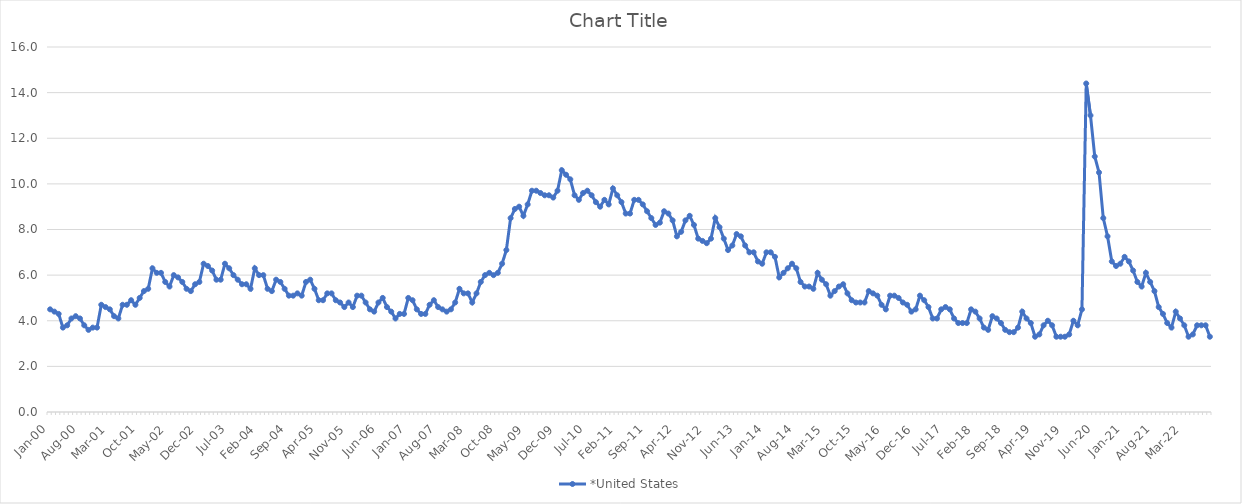
| Category | *United States | Alaska | Alabama | Arkansas | Arizona | California | Colorado | Connecticut | Delaware | Florida | Georgia | Hawaii | Iowa | Idaho | Illinois | Indiana | Kansas | Kentucky | Louisiana | Massachusetts | Maryland | Maine | Michigan | Minnesota | Missouri | Mississippi | Montana | North Carolina | North Dakota | Nebraska | New Hampshire | New Jersey | New Mexico | Nevada | New York | Ohio | Oklahoma | Oregon | Pennsylvania | Rhode Island | South Carolina | South Dakota | Tennessee | Texas | Utah | Virginia | Vermont | Washington | Wisconsin | West Virginia | Wyoming |
|---|---|---|---|---|---|---|---|---|---|---|---|---|---|---|---|---|---|---|---|---|---|---|---|---|---|---|---|---|---|---|---|---|---|---|---|---|---|---|---|---|---|---|---|---|---|---|---|---|---|---|---|
| Jan-00 | 4.5 |  |  |  |  |  |  |  |  |  |  |  |  |  |  |  |  |  |  |  |  |  |  |  |  |  |  |  |  |  |  |  |  |  |  |  |  |  |  |  |  |  |  |  |  |  |  |  |  |  |  |
| Feb-00 | 4.4 |  |  |  |  |  |  |  |  |  |  |  |  |  |  |  |  |  |  |  |  |  |  |  |  |  |  |  |  |  |  |  |  |  |  |  |  |  |  |  |  |  |  |  |  |  |  |  |  |  |  |
| Mar-00 | 4.3 |  |  |  |  |  |  |  |  |  |  |  |  |  |  |  |  |  |  |  |  |  |  |  |  |  |  |  |  |  |  |  |  |  |  |  |  |  |  |  |  |  |  |  |  |  |  |  |  |  |  |
| Apr-00 | 3.7 |  |  |  |  |  |  |  |  |  |  |  |  |  |  |  |  |  |  |  |  |  |  |  |  |  |  |  |  |  |  |  |  |  |  |  |  |  |  |  |  |  |  |  |  |  |  |  |  |  |  |
| May-00 | 3.8 |  |  |  |  |  |  |  |  |  |  |  |  |  |  |  |  |  |  |  |  |  |  |  |  |  |  |  |  |  |  |  |  |  |  |  |  |  |  |  |  |  |  |  |  |  |  |  |  |  |  |
| Jun-00 | 4.1 |  |  |  |  |  |  |  |  |  |  |  |  |  |  |  |  |  |  |  |  |  |  |  |  |  |  |  |  |  |  |  |  |  |  |  |  |  |  |  |  |  |  |  |  |  |  |  |  |  |  |
| Jul-00 | 4.2 |  |  |  |  |  |  |  |  |  |  |  |  |  |  |  |  |  |  |  |  |  |  |  |  |  |  |  |  |  |  |  |  |  |  |  |  |  |  |  |  |  |  |  |  |  |  |  |  |  |  |
| Aug-00 | 4.1 |  |  |  |  |  |  |  |  |  |  |  |  |  |  |  |  |  |  |  |  |  |  |  |  |  |  |  |  |  |  |  |  |  |  |  |  |  |  |  |  |  |  |  |  |  |  |  |  |  |  |
| Sep-00 | 3.8 |  |  |  |  |  |  |  |  |  |  |  |  |  |  |  |  |  |  |  |  |  |  |  |  |  |  |  |  |  |  |  |  |  |  |  |  |  |  |  |  |  |  |  |  |  |  |  |  |  |  |
| Oct-00 | 3.6 |  |  |  |  |  |  |  |  |  |  |  |  |  |  |  |  |  |  |  |  |  |  |  |  |  |  |  |  |  |  |  |  |  |  |  |  |  |  |  |  |  |  |  |  |  |  |  |  |  |  |
| Nov-00 | 3.7 |  |  |  |  |  |  |  |  |  |  |  |  |  |  |  |  |  |  |  |  |  |  |  |  |  |  |  |  |  |  |  |  |  |  |  |  |  |  |  |  |  |  |  |  |  |  |  |  |  |  |
| Dec-00 | 3.7 |  |  |  |  |  |  |  |  |  |  |  |  |  |  |  |  |  |  |  |  |  |  |  |  |  |  |  |  |  |  |  |  |  |  |  |  |  |  |  |  |  |  |  |  |  |  |  |  |  |  |
| Jan-01 | 4.7 |  |  |  |  |  |  |  |  |  |  |  |  |  |  |  |  |  |  |  |  |  |  |  |  |  |  |  |  |  |  |  |  |  |  |  |  |  |  |  |  |  |  |  |  |  |  |  |  |  |  |
| Feb-01 | 4.6 |  |  |  |  |  |  |  |  |  |  |  |  |  |  |  |  |  |  |  |  |  |  |  |  |  |  |  |  |  |  |  |  |  |  |  |  |  |  |  |  |  |  |  |  |  |  |  |  |  |  |
| Mar-01 | 4.5 |  |  |  |  |  |  |  |  |  |  |  |  |  |  |  |  |  |  |  |  |  |  |  |  |  |  |  |  |  |  |  |  |  |  |  |  |  |  |  |  |  |  |  |  |  |  |  |  |  |  |
| Apr-01 | 4.2 |  |  |  |  |  |  |  |  |  |  |  |  |  |  |  |  |  |  |  |  |  |  |  |  |  |  |  |  |  |  |  |  |  |  |  |  |  |  |  |  |  |  |  |  |  |  |  |  |  |  |
| May-01 | 4.1 |  |  |  |  |  |  |  |  |  |  |  |  |  |  |  |  |  |  |  |  |  |  |  |  |  |  |  |  |  |  |  |  |  |  |  |  |  |  |  |  |  |  |  |  |  |  |  |  |  |  |
| Jun-01 | 4.7 |  |  |  |  |  |  |  |  |  |  |  |  |  |  |  |  |  |  |  |  |  |  |  |  |  |  |  |  |  |  |  |  |  |  |  |  |  |  |  |  |  |  |  |  |  |  |  |  |  |  |
| Jul-01 | 4.7 |  |  |  |  |  |  |  |  |  |  |  |  |  |  |  |  |  |  |  |  |  |  |  |  |  |  |  |  |  |  |  |  |  |  |  |  |  |  |  |  |  |  |  |  |  |  |  |  |  |  |
| Aug-01 | 4.9 |  |  |  |  |  |  |  |  |  |  |  |  |  |  |  |  |  |  |  |  |  |  |  |  |  |  |  |  |  |  |  |  |  |  |  |  |  |  |  |  |  |  |  |  |  |  |  |  |  |  |
| Sep-01 | 4.7 |  |  |  |  |  |  |  |  |  |  |  |  |  |  |  |  |  |  |  |  |  |  |  |  |  |  |  |  |  |  |  |  |  |  |  |  |  |  |  |  |  |  |  |  |  |  |  |  |  |  |
| Oct-01 | 5 |  |  |  |  |  |  |  |  |  |  |  |  |  |  |  |  |  |  |  |  |  |  |  |  |  |  |  |  |  |  |  |  |  |  |  |  |  |  |  |  |  |  |  |  |  |  |  |  |  |  |
| Nov-01 | 5.3 |  |  |  |  |  |  |  |  |  |  |  |  |  |  |  |  |  |  |  |  |  |  |  |  |  |  |  |  |  |  |  |  |  |  |  |  |  |  |  |  |  |  |  |  |  |  |  |  |  |  |
| Dec-01 | 5.4 |  |  |  |  |  |  |  |  |  |  |  |  |  |  |  |  |  |  |  |  |  |  |  |  |  |  |  |  |  |  |  |  |  |  |  |  |  |  |  |  |  |  |  |  |  |  |  |  |  |  |
| Jan-02 | 6.3 |  |  |  |  |  |  |  |  |  |  |  |  |  |  |  |  |  |  |  |  |  |  |  |  |  |  |  |  |  |  |  |  |  |  |  |  |  |  |  |  |  |  |  |  |  |  |  |  |  |  |
| Feb-02 | 6.1 |  |  |  |  |  |  |  |  |  |  |  |  |  |  |  |  |  |  |  |  |  |  |  |  |  |  |  |  |  |  |  |  |  |  |  |  |  |  |  |  |  |  |  |  |  |  |  |  |  |  |
| Mar-02 | 6.1 |  |  |  |  |  |  |  |  |  |  |  |  |  |  |  |  |  |  |  |  |  |  |  |  |  |  |  |  |  |  |  |  |  |  |  |  |  |  |  |  |  |  |  |  |  |  |  |  |  |  |
| Apr-02 | 5.7 |  |  |  |  |  |  |  |  |  |  |  |  |  |  |  |  |  |  |  |  |  |  |  |  |  |  |  |  |  |  |  |  |  |  |  |  |  |  |  |  |  |  |  |  |  |  |  |  |  |  |
| May-02 | 5.5 |  |  |  |  |  |  |  |  |  |  |  |  |  |  |  |  |  |  |  |  |  |  |  |  |  |  |  |  |  |  |  |  |  |  |  |  |  |  |  |  |  |  |  |  |  |  |  |  |  |  |
| Jun-02 | 6 |  |  |  |  |  |  |  |  |  |  |  |  |  |  |  |  |  |  |  |  |  |  |  |  |  |  |  |  |  |  |  |  |  |  |  |  |  |  |  |  |  |  |  |  |  |  |  |  |  |  |
| Jul-02 | 5.9 |  |  |  |  |  |  |  |  |  |  |  |  |  |  |  |  |  |  |  |  |  |  |  |  |  |  |  |  |  |  |  |  |  |  |  |  |  |  |  |  |  |  |  |  |  |  |  |  |  |  |
| Aug-02 | 5.7 |  |  |  |  |  |  |  |  |  |  |  |  |  |  |  |  |  |  |  |  |  |  |  |  |  |  |  |  |  |  |  |  |  |  |  |  |  |  |  |  |  |  |  |  |  |  |  |  |  |  |
| Sep-02 | 5.4 |  |  |  |  |  |  |  |  |  |  |  |  |  |  |  |  |  |  |  |  |  |  |  |  |  |  |  |  |  |  |  |  |  |  |  |  |  |  |  |  |  |  |  |  |  |  |  |  |  |  |
| Oct-02 | 5.3 |  |  |  |  |  |  |  |  |  |  |  |  |  |  |  |  |  |  |  |  |  |  |  |  |  |  |  |  |  |  |  |  |  |  |  |  |  |  |  |  |  |  |  |  |  |  |  |  |  |  |
| Nov-02 | 5.6 |  |  |  |  |  |  |  |  |  |  |  |  |  |  |  |  |  |  |  |  |  |  |  |  |  |  |  |  |  |  |  |  |  |  |  |  |  |  |  |  |  |  |  |  |  |  |  |  |  |  |
| Dec-02 | 5.7 |  |  |  |  |  |  |  |  |  |  |  |  |  |  |  |  |  |  |  |  |  |  |  |  |  |  |  |  |  |  |  |  |  |  |  |  |  |  |  |  |  |  |  |  |  |  |  |  |  |  |
| Jan-03 | 6.5 |  |  |  |  |  |  |  |  |  |  |  |  |  |  |  |  |  |  |  |  |  |  |  |  |  |  |  |  |  |  |  |  |  |  |  |  |  |  |  |  |  |  |  |  |  |  |  |  |  |  |
| Feb-03 | 6.4 |  |  |  |  |  |  |  |  |  |  |  |  |  |  |  |  |  |  |  |  |  |  |  |  |  |  |  |  |  |  |  |  |  |  |  |  |  |  |  |  |  |  |  |  |  |  |  |  |  |  |
| Mar-03 | 6.2 |  |  |  |  |  |  |  |  |  |  |  |  |  |  |  |  |  |  |  |  |  |  |  |  |  |  |  |  |  |  |  |  |  |  |  |  |  |  |  |  |  |  |  |  |  |  |  |  |  |  |
| Apr-03 | 5.8 |  |  |  |  |  |  |  |  |  |  |  |  |  |  |  |  |  |  |  |  |  |  |  |  |  |  |  |  |  |  |  |  |  |  |  |  |  |  |  |  |  |  |  |  |  |  |  |  |  |  |
| May-03 | 5.8 |  |  |  |  |  |  |  |  |  |  |  |  |  |  |  |  |  |  |  |  |  |  |  |  |  |  |  |  |  |  |  |  |  |  |  |  |  |  |  |  |  |  |  |  |  |  |  |  |  |  |
| Jun-03 | 6.5 |  |  |  |  |  |  |  |  |  |  |  |  |  |  |  |  |  |  |  |  |  |  |  |  |  |  |  |  |  |  |  |  |  |  |  |  |  |  |  |  |  |  |  |  |  |  |  |  |  |  |
| Jul-03 | 6.3 |  |  |  |  |  |  |  |  |  |  |  |  |  |  |  |  |  |  |  |  |  |  |  |  |  |  |  |  |  |  |  |  |  |  |  |  |  |  |  |  |  |  |  |  |  |  |  |  |  |  |
| Aug-03 | 6 |  |  |  |  |  |  |  |  |  |  |  |  |  |  |  |  |  |  |  |  |  |  |  |  |  |  |  |  |  |  |  |  |  |  |  |  |  |  |  |  |  |  |  |  |  |  |  |  |  |  |
| Sep-03 | 5.8 |  |  |  |  |  |  |  |  |  |  |  |  |  |  |  |  |  |  |  |  |  |  |  |  |  |  |  |  |  |  |  |  |  |  |  |  |  |  |  |  |  |  |  |  |  |  |  |  |  |  |
| Oct-03 | 5.6 |  |  |  |  |  |  |  |  |  |  |  |  |  |  |  |  |  |  |  |  |  |  |  |  |  |  |  |  |  |  |  |  |  |  |  |  |  |  |  |  |  |  |  |  |  |  |  |  |  |  |
| Nov-03 | 5.6 |  |  |  |  |  |  |  |  |  |  |  |  |  |  |  |  |  |  |  |  |  |  |  |  |  |  |  |  |  |  |  |  |  |  |  |  |  |  |  |  |  |  |  |  |  |  |  |  |  |  |
| Dec-03 | 5.4 |  |  |  |  |  |  |  |  |  |  |  |  |  |  |  |  |  |  |  |  |  |  |  |  |  |  |  |  |  |  |  |  |  |  |  |  |  |  |  |  |  |  |  |  |  |  |  |  |  |  |
| Jan-04 | 6.3 |  |  |  |  |  |  |  |  |  |  |  |  |  |  |  |  |  |  |  |  |  |  |  |  |  |  |  |  |  |  |  |  |  |  |  |  |  |  |  |  |  |  |  |  |  |  |  |  |  |  |
| Feb-04 | 6 |  |  |  |  |  |  |  |  |  |  |  |  |  |  |  |  |  |  |  |  |  |  |  |  |  |  |  |  |  |  |  |  |  |  |  |  |  |  |  |  |  |  |  |  |  |  |  |  |  |  |
| Mar-04 | 6 |  |  |  |  |  |  |  |  |  |  |  |  |  |  |  |  |  |  |  |  |  |  |  |  |  |  |  |  |  |  |  |  |  |  |  |  |  |  |  |  |  |  |  |  |  |  |  |  |  |  |
| Apr-04 | 5.4 |  |  |  |  |  |  |  |  |  |  |  |  |  |  |  |  |  |  |  |  |  |  |  |  |  |  |  |  |  |  |  |  |  |  |  |  |  |  |  |  |  |  |  |  |  |  |  |  |  |  |
| May-04 | 5.3 |  |  |  |  |  |  |  |  |  |  |  |  |  |  |  |  |  |  |  |  |  |  |  |  |  |  |  |  |  |  |  |  |  |  |  |  |  |  |  |  |  |  |  |  |  |  |  |  |  |  |
| Jun-04 | 5.8 |  |  |  |  |  |  |  |  |  |  |  |  |  |  |  |  |  |  |  |  |  |  |  |  |  |  |  |  |  |  |  |  |  |  |  |  |  |  |  |  |  |  |  |  |  |  |  |  |  |  |
| Jul-04 | 5.7 |  |  |  |  |  |  |  |  |  |  |  |  |  |  |  |  |  |  |  |  |  |  |  |  |  |  |  |  |  |  |  |  |  |  |  |  |  |  |  |  |  |  |  |  |  |  |  |  |  |  |
| Aug-04 | 5.4 |  |  |  |  |  |  |  |  |  |  |  |  |  |  |  |  |  |  |  |  |  |  |  |  |  |  |  |  |  |  |  |  |  |  |  |  |  |  |  |  |  |  |  |  |  |  |  |  |  |  |
| Sep-04 | 5.1 |  |  |  |  |  |  |  |  |  |  |  |  |  |  |  |  |  |  |  |  |  |  |  |  |  |  |  |  |  |  |  |  |  |  |  |  |  |  |  |  |  |  |  |  |  |  |  |  |  |  |
| Oct-04 | 5.1 |  |  |  |  |  |  |  |  |  |  |  |  |  |  |  |  |  |  |  |  |  |  |  |  |  |  |  |  |  |  |  |  |  |  |  |  |  |  |  |  |  |  |  |  |  |  |  |  |  |  |
| Nov-04 | 5.2 |  |  |  |  |  |  |  |  |  |  |  |  |  |  |  |  |  |  |  |  |  |  |  |  |  |  |  |  |  |  |  |  |  |  |  |  |  |  |  |  |  |  |  |  |  |  |  |  |  |  |
| Dec-04 | 5.1 |  |  |  |  |  |  |  |  |  |  |  |  |  |  |  |  |  |  |  |  |  |  |  |  |  |  |  |  |  |  |  |  |  |  |  |  |  |  |  |  |  |  |  |  |  |  |  |  |  |  |
| Jan-05 | 5.7 |  |  |  |  |  |  |  |  |  |  |  |  |  |  |  |  |  |  |  |  |  |  |  |  |  |  |  |  |  |  |  |  |  |  |  |  |  |  |  |  |  |  |  |  |  |  |  |  |  |  |
| Feb-05 | 5.8 |  |  |  |  |  |  |  |  |  |  |  |  |  |  |  |  |  |  |  |  |  |  |  |  |  |  |  |  |  |  |  |  |  |  |  |  |  |  |  |  |  |  |  |  |  |  |  |  |  |  |
| Mar-05 | 5.4 |  |  |  |  |  |  |  |  |  |  |  |  |  |  |  |  |  |  |  |  |  |  |  |  |  |  |  |  |  |  |  |  |  |  |  |  |  |  |  |  |  |  |  |  |  |  |  |  |  |  |
| Apr-05 | 4.9 |  |  |  |  |  |  |  |  |  |  |  |  |  |  |  |  |  |  |  |  |  |  |  |  |  |  |  |  |  |  |  |  |  |  |  |  |  |  |  |  |  |  |  |  |  |  |  |  |  |  |
| May-05 | 4.9 |  |  |  |  |  |  |  |  |  |  |  |  |  |  |  |  |  |  |  |  |  |  |  |  |  |  |  |  |  |  |  |  |  |  |  |  |  |  |  |  |  |  |  |  |  |  |  |  |  |  |
| Jun-05 | 5.2 |  |  |  |  |  |  |  |  |  |  |  |  |  |  |  |  |  |  |  |  |  |  |  |  |  |  |  |  |  |  |  |  |  |  |  |  |  |  |  |  |  |  |  |  |  |  |  |  |  |  |
| Jul-05 | 5.2 |  |  |  |  |  |  |  |  |  |  |  |  |  |  |  |  |  |  |  |  |  |  |  |  |  |  |  |  |  |  |  |  |  |  |  |  |  |  |  |  |  |  |  |  |  |  |  |  |  |  |
| Aug-05 | 4.9 |  |  |  |  |  |  |  |  |  |  |  |  |  |  |  |  |  |  |  |  |  |  |  |  |  |  |  |  |  |  |  |  |  |  |  |  |  |  |  |  |  |  |  |  |  |  |  |  |  |  |
| Sep-05 | 4.8 |  |  |  |  |  |  |  |  |  |  |  |  |  |  |  |  |  |  |  |  |  |  |  |  |  |  |  |  |  |  |  |  |  |  |  |  |  |  |  |  |  |  |  |  |  |  |  |  |  |  |
| Oct-05 | 4.6 |  |  |  |  |  |  |  |  |  |  |  |  |  |  |  |  |  |  |  |  |  |  |  |  |  |  |  |  |  |  |  |  |  |  |  |  |  |  |  |  |  |  |  |  |  |  |  |  |  |  |
| Nov-05 | 4.8 |  |  |  |  |  |  |  |  |  |  |  |  |  |  |  |  |  |  |  |  |  |  |  |  |  |  |  |  |  |  |  |  |  |  |  |  |  |  |  |  |  |  |  |  |  |  |  |  |  |  |
| Dec-05 | 4.6 |  |  |  |  |  |  |  |  |  |  |  |  |  |  |  |  |  |  |  |  |  |  |  |  |  |  |  |  |  |  |  |  |  |  |  |  |  |  |  |  |  |  |  |  |  |  |  |  |  |  |
| Jan-06 | 5.1 |  |  |  |  |  |  |  |  |  |  |  |  |  |  |  |  |  |  |  |  |  |  |  |  |  |  |  |  |  |  |  |  |  |  |  |  |  |  |  |  |  |  |  |  |  |  |  |  |  |  |
| Feb-06 | 5.1 |  |  |  |  |  |  |  |  |  |  |  |  |  |  |  |  |  |  |  |  |  |  |  |  |  |  |  |  |  |  |  |  |  |  |  |  |  |  |  |  |  |  |  |  |  |  |  |  |  |  |
| Mar-06 | 4.8 |  |  |  |  |  |  |  |  |  |  |  |  |  |  |  |  |  |  |  |  |  |  |  |  |  |  |  |  |  |  |  |  |  |  |  |  |  |  |  |  |  |  |  |  |  |  |  |  |  |  |
| Apr-06 | 4.5 |  |  |  |  |  |  |  |  |  |  |  |  |  |  |  |  |  |  |  |  |  |  |  |  |  |  |  |  |  |  |  |  |  |  |  |  |  |  |  |  |  |  |  |  |  |  |  |  |  |  |
| May-06 | 4.4 |  |  |  |  |  |  |  |  |  |  |  |  |  |  |  |  |  |  |  |  |  |  |  |  |  |  |  |  |  |  |  |  |  |  |  |  |  |  |  |  |  |  |  |  |  |  |  |  |  |  |
| Jun-06 | 4.8 |  |  |  |  |  |  |  |  |  |  |  |  |  |  |  |  |  |  |  |  |  |  |  |  |  |  |  |  |  |  |  |  |  |  |  |  |  |  |  |  |  |  |  |  |  |  |  |  |  |  |
| Jul-06 | 5 |  |  |  |  |  |  |  |  |  |  |  |  |  |  |  |  |  |  |  |  |  |  |  |  |  |  |  |  |  |  |  |  |  |  |  |  |  |  |  |  |  |  |  |  |  |  |  |  |  |  |
| Aug-06 | 4.6 |  |  |  |  |  |  |  |  |  |  |  |  |  |  |  |  |  |  |  |  |  |  |  |  |  |  |  |  |  |  |  |  |  |  |  |  |  |  |  |  |  |  |  |  |  |  |  |  |  |  |
| Sep-06 | 4.4 |  |  |  |  |  |  |  |  |  |  |  |  |  |  |  |  |  |  |  |  |  |  |  |  |  |  |  |  |  |  |  |  |  |  |  |  |  |  |  |  |  |  |  |  |  |  |  |  |  |  |
| Oct-06 | 4.1 |  |  |  |  |  |  |  |  |  |  |  |  |  |  |  |  |  |  |  |  |  |  |  |  |  |  |  |  |  |  |  |  |  |  |  |  |  |  |  |  |  |  |  |  |  |  |  |  |  |  |
| Nov-06 | 4.3 |  |  |  |  |  |  |  |  |  |  |  |  |  |  |  |  |  |  |  |  |  |  |  |  |  |  |  |  |  |  |  |  |  |  |  |  |  |  |  |  |  |  |  |  |  |  |  |  |  |  |
| Dec-06 | 4.3 |  |  |  |  |  |  |  |  |  |  |  |  |  |  |  |  |  |  |  |  |  |  |  |  |  |  |  |  |  |  |  |  |  |  |  |  |  |  |  |  |  |  |  |  |  |  |  |  |  |  |
| Jan-07 | 5 |  |  |  |  |  |  |  |  |  |  |  |  |  |  |  |  |  |  |  |  |  |  |  |  |  |  |  |  |  |  |  |  |  |  |  |  |  |  |  |  |  |  |  |  |  |  |  |  |  |  |
| Feb-07 | 4.9 |  |  |  |  |  |  |  |  |  |  |  |  |  |  |  |  |  |  |  |  |  |  |  |  |  |  |  |  |  |  |  |  |  |  |  |  |  |  |  |  |  |  |  |  |  |  |  |  |  |  |
| Mar-07 | 4.5 |  |  |  |  |  |  |  |  |  |  |  |  |  |  |  |  |  |  |  |  |  |  |  |  |  |  |  |  |  |  |  |  |  |  |  |  |  |  |  |  |  |  |  |  |  |  |  |  |  |  |
| Apr-07 | 4.3 |  |  |  |  |  |  |  |  |  |  |  |  |  |  |  |  |  |  |  |  |  |  |  |  |  |  |  |  |  |  |  |  |  |  |  |  |  |  |  |  |  |  |  |  |  |  |  |  |  |  |
| May-07 | 4.3 |  |  |  |  |  |  |  |  |  |  |  |  |  |  |  |  |  |  |  |  |  |  |  |  |  |  |  |  |  |  |  |  |  |  |  |  |  |  |  |  |  |  |  |  |  |  |  |  |  |  |
| Jun-07 | 4.7 |  |  |  |  |  |  |  |  |  |  |  |  |  |  |  |  |  |  |  |  |  |  |  |  |  |  |  |  |  |  |  |  |  |  |  |  |  |  |  |  |  |  |  |  |  |  |  |  |  |  |
| Jul-07 | 4.9 |  |  |  |  |  |  |  |  |  |  |  |  |  |  |  |  |  |  |  |  |  |  |  |  |  |  |  |  |  |  |  |  |  |  |  |  |  |  |  |  |  |  |  |  |  |  |  |  |  |  |
| Aug-07 | 4.6 |  |  |  |  |  |  |  |  |  |  |  |  |  |  |  |  |  |  |  |  |  |  |  |  |  |  |  |  |  |  |  |  |  |  |  |  |  |  |  |  |  |  |  |  |  |  |  |  |  |  |
| Sep-07 | 4.5 |  |  |  |  |  |  |  |  |  |  |  |  |  |  |  |  |  |  |  |  |  |  |  |  |  |  |  |  |  |  |  |  |  |  |  |  |  |  |  |  |  |  |  |  |  |  |  |  |  |  |
| Oct-07 | 4.4 |  |  |  |  |  |  |  |  |  |  |  |  |  |  |  |  |  |  |  |  |  |  |  |  |  |  |  |  |  |  |  |  |  |  |  |  |  |  |  |  |  |  |  |  |  |  |  |  |  |  |
| Nov-07 | 4.5 |  |  |  |  |  |  |  |  |  |  |  |  |  |  |  |  |  |  |  |  |  |  |  |  |  |  |  |  |  |  |  |  |  |  |  |  |  |  |  |  |  |  |  |  |  |  |  |  |  |  |
| Dec-07 | 4.8 |  |  |  |  |  |  |  |  |  |  |  |  |  |  |  |  |  |  |  |  |  |  |  |  |  |  |  |  |  |  |  |  |  |  |  |  |  |  |  |  |  |  |  |  |  |  |  |  |  |  |
| Jan-08 | 5.4 |  |  |  |  |  |  |  |  |  |  |  |  |  |  |  |  |  |  |  |  |  |  |  |  |  |  |  |  |  |  |  |  |  |  |  |  |  |  |  |  |  |  |  |  |  |  |  |  |  |  |
| Feb-08 | 5.2 |  |  |  |  |  |  |  |  |  |  |  |  |  |  |  |  |  |  |  |  |  |  |  |  |  |  |  |  |  |  |  |  |  |  |  |  |  |  |  |  |  |  |  |  |  |  |  |  |  |  |
| Mar-08 | 5.2 |  |  |  |  |  |  |  |  |  |  |  |  |  |  |  |  |  |  |  |  |  |  |  |  |  |  |  |  |  |  |  |  |  |  |  |  |  |  |  |  |  |  |  |  |  |  |  |  |  |  |
| Apr-08 | 4.8 |  |  |  |  |  |  |  |  |  |  |  |  |  |  |  |  |  |  |  |  |  |  |  |  |  |  |  |  |  |  |  |  |  |  |  |  |  |  |  |  |  |  |  |  |  |  |  |  |  |  |
| May-08 | 5.2 |  |  |  |  |  |  |  |  |  |  |  |  |  |  |  |  |  |  |  |  |  |  |  |  |  |  |  |  |  |  |  |  |  |  |  |  |  |  |  |  |  |  |  |  |  |  |  |  |  |  |
| Jun-08 | 5.7 |  |  |  |  |  |  |  |  |  |  |  |  |  |  |  |  |  |  |  |  |  |  |  |  |  |  |  |  |  |  |  |  |  |  |  |  |  |  |  |  |  |  |  |  |  |  |  |  |  |  |
| Jul-08 | 6 |  |  |  |  |  |  |  |  |  |  |  |  |  |  |  |  |  |  |  |  |  |  |  |  |  |  |  |  |  |  |  |  |  |  |  |  |  |  |  |  |  |  |  |  |  |  |  |  |  |  |
| Aug-08 | 6.1 |  |  |  |  |  |  |  |  |  |  |  |  |  |  |  |  |  |  |  |  |  |  |  |  |  |  |  |  |  |  |  |  |  |  |  |  |  |  |  |  |  |  |  |  |  |  |  |  |  |  |
| Sep-08 | 6 |  |  |  |  |  |  |  |  |  |  |  |  |  |  |  |  |  |  |  |  |  |  |  |  |  |  |  |  |  |  |  |  |  |  |  |  |  |  |  |  |  |  |  |  |  |  |  |  |  |  |
| Oct-08 | 6.1 |  |  |  |  |  |  |  |  |  |  |  |  |  |  |  |  |  |  |  |  |  |  |  |  |  |  |  |  |  |  |  |  |  |  |  |  |  |  |  |  |  |  |  |  |  |  |  |  |  |  |
| Nov-08 | 6.5 |  |  |  |  |  |  |  |  |  |  |  |  |  |  |  |  |  |  |  |  |  |  |  |  |  |  |  |  |  |  |  |  |  |  |  |  |  |  |  |  |  |  |  |  |  |  |  |  |  |  |
| Dec-08 | 7.1 |  |  |  |  |  |  |  |  |  |  |  |  |  |  |  |  |  |  |  |  |  |  |  |  |  |  |  |  |  |  |  |  |  |  |  |  |  |  |  |  |  |  |  |  |  |  |  |  |  |  |
| Jan-09 | 8.5 |  |  |  |  |  |  |  |  |  |  |  |  |  |  |  |  |  |  |  |  |  |  |  |  |  |  |  |  |  |  |  |  |  |  |  |  |  |  |  |  |  |  |  |  |  |  |  |  |  |  |
| Feb-09 | 8.9 |  |  |  |  |  |  |  |  |  |  |  |  |  |  |  |  |  |  |  |  |  |  |  |  |  |  |  |  |  |  |  |  |  |  |  |  |  |  |  |  |  |  |  |  |  |  |  |  |  |  |
| Mar-09 | 9 |  |  |  |  |  |  |  |  |  |  |  |  |  |  |  |  |  |  |  |  |  |  |  |  |  |  |  |  |  |  |  |  |  |  |  |  |  |  |  |  |  |  |  |  |  |  |  |  |  |  |
| Apr-09 | 8.6 |  |  |  |  |  |  |  |  |  |  |  |  |  |  |  |  |  |  |  |  |  |  |  |  |  |  |  |  |  |  |  |  |  |  |  |  |  |  |  |  |  |  |  |  |  |  |  |  |  |  |
| May-09 | 9.1 |  |  |  |  |  |  |  |  |  |  |  |  |  |  |  |  |  |  |  |  |  |  |  |  |  |  |  |  |  |  |  |  |  |  |  |  |  |  |  |  |  |  |  |  |  |  |  |  |  |  |
| Jun-09 | 9.7 |  |  |  |  |  |  |  |  |  |  |  |  |  |  |  |  |  |  |  |  |  |  |  |  |  |  |  |  |  |  |  |  |  |  |  |  |  |  |  |  |  |  |  |  |  |  |  |  |  |  |
| Jul-09 | 9.7 |  |  |  |  |  |  |  |  |  |  |  |  |  |  |  |  |  |  |  |  |  |  |  |  |  |  |  |  |  |  |  |  |  |  |  |  |  |  |  |  |  |  |  |  |  |  |  |  |  |  |
| Aug-09 | 9.6 |  |  |  |  |  |  |  |  |  |  |  |  |  |  |  |  |  |  |  |  |  |  |  |  |  |  |  |  |  |  |  |  |  |  |  |  |  |  |  |  |  |  |  |  |  |  |  |  |  |  |
| Sep-09 | 9.5 |  |  |  |  |  |  |  |  |  |  |  |  |  |  |  |  |  |  |  |  |  |  |  |  |  |  |  |  |  |  |  |  |  |  |  |  |  |  |  |  |  |  |  |  |  |  |  |  |  |  |
| Oct-09 | 9.5 |  |  |  |  |  |  |  |  |  |  |  |  |  |  |  |  |  |  |  |  |  |  |  |  |  |  |  |  |  |  |  |  |  |  |  |  |  |  |  |  |  |  |  |  |  |  |  |  |  |  |
| Nov-09 | 9.4 |  |  |  |  |  |  |  |  |  |  |  |  |  |  |  |  |  |  |  |  |  |  |  |  |  |  |  |  |  |  |  |  |  |  |  |  |  |  |  |  |  |  |  |  |  |  |  |  |  |  |
| Dec-09 | 9.7 |  |  |  |  |  |  |  |  |  |  |  |  |  |  |  |  |  |  |  |  |  |  |  |  |  |  |  |  |  |  |  |  |  |  |  |  |  |  |  |  |  |  |  |  |  |  |  |  |  |  |
| Jan-10 | 10.6 |  |  |  |  |  |  |  |  |  |  |  |  |  |  |  |  |  |  |  |  |  |  |  |  |  |  |  |  |  |  |  |  |  |  |  |  |  |  |  |  |  |  |  |  |  |  |  |  |  |  |
| Feb-10 | 10.4 |  |  |  |  |  |  |  |  |  |  |  |  |  |  |  |  |  |  |  |  |  |  |  |  |  |  |  |  |  |  |  |  |  |  |  |  |  |  |  |  |  |  |  |  |  |  |  |  |  |  |
| Mar-10 | 10.2 |  |  |  |  |  |  |  |  |  |  |  |  |  |  |  |  |  |  |  |  |  |  |  |  |  |  |  |  |  |  |  |  |  |  |  |  |  |  |  |  |  |  |  |  |  |  |  |  |  |  |
| Apr-10 | 9.5 |  |  |  |  |  |  |  |  |  |  |  |  |  |  |  |  |  |  |  |  |  |  |  |  |  |  |  |  |  |  |  |  |  |  |  |  |  |  |  |  |  |  |  |  |  |  |  |  |  |  |
| May-10 | 9.3 |  |  |  |  |  |  |  |  |  |  |  |  |  |  |  |  |  |  |  |  |  |  |  |  |  |  |  |  |  |  |  |  |  |  |  |  |  |  |  |  |  |  |  |  |  |  |  |  |  |  |
| Jun-10 | 9.6 |  |  |  |  |  |  |  |  |  |  |  |  |  |  |  |  |  |  |  |  |  |  |  |  |  |  |  |  |  |  |  |  |  |  |  |  |  |  |  |  |  |  |  |  |  |  |  |  |  |  |
| Jul-10 | 9.7 |  |  |  |  |  |  |  |  |  |  |  |  |  |  |  |  |  |  |  |  |  |  |  |  |  |  |  |  |  |  |  |  |  |  |  |  |  |  |  |  |  |  |  |  |  |  |  |  |  |  |
| Aug-10 | 9.5 |  |  |  |  |  |  |  |  |  |  |  |  |  |  |  |  |  |  |  |  |  |  |  |  |  |  |  |  |  |  |  |  |  |  |  |  |  |  |  |  |  |  |  |  |  |  |  |  |  |  |
| Sep-10 | 9.2 |  |  |  |  |  |  |  |  |  |  |  |  |  |  |  |  |  |  |  |  |  |  |  |  |  |  |  |  |  |  |  |  |  |  |  |  |  |  |  |  |  |  |  |  |  |  |  |  |  |  |
| Oct-10 | 9 |  |  |  |  |  |  |  |  |  |  |  |  |  |  |  |  |  |  |  |  |  |  |  |  |  |  |  |  |  |  |  |  |  |  |  |  |  |  |  |  |  |  |  |  |  |  |  |  |  |  |
| Nov-10 | 9.3 |  |  |  |  |  |  |  |  |  |  |  |  |  |  |  |  |  |  |  |  |  |  |  |  |  |  |  |  |  |  |  |  |  |  |  |  |  |  |  |  |  |  |  |  |  |  |  |  |  |  |
| Dec-10 | 9.1 |  |  |  |  |  |  |  |  |  |  |  |  |  |  |  |  |  |  |  |  |  |  |  |  |  |  |  |  |  |  |  |  |  |  |  |  |  |  |  |  |  |  |  |  |  |  |  |  |  |  |
| Jan-11 | 9.8 |  |  |  |  |  |  |  |  |  |  |  |  |  |  |  |  |  |  |  |  |  |  |  |  |  |  |  |  |  |  |  |  |  |  |  |  |  |  |  |  |  |  |  |  |  |  |  |  |  |  |
| Feb-11 | 9.5 |  |  |  |  |  |  |  |  |  |  |  |  |  |  |  |  |  |  |  |  |  |  |  |  |  |  |  |  |  |  |  |  |  |  |  |  |  |  |  |  |  |  |  |  |  |  |  |  |  |  |
| Mar-11 | 9.2 |  |  |  |  |  |  |  |  |  |  |  |  |  |  |  |  |  |  |  |  |  |  |  |  |  |  |  |  |  |  |  |  |  |  |  |  |  |  |  |  |  |  |  |  |  |  |  |  |  |  |
| Apr-11 | 8.7 |  |  |  |  |  |  |  |  |  |  |  |  |  |  |  |  |  |  |  |  |  |  |  |  |  |  |  |  |  |  |  |  |  |  |  |  |  |  |  |  |  |  |  |  |  |  |  |  |  |  |
| May-11 | 8.7 |  |  |  |  |  |  |  |  |  |  |  |  |  |  |  |  |  |  |  |  |  |  |  |  |  |  |  |  |  |  |  |  |  |  |  |  |  |  |  |  |  |  |  |  |  |  |  |  |  |  |
| Jun-11 | 9.3 |  |  |  |  |  |  |  |  |  |  |  |  |  |  |  |  |  |  |  |  |  |  |  |  |  |  |  |  |  |  |  |  |  |  |  |  |  |  |  |  |  |  |  |  |  |  |  |  |  |  |
| Jul-11 | 9.3 |  |  |  |  |  |  |  |  |  |  |  |  |  |  |  |  |  |  |  |  |  |  |  |  |  |  |  |  |  |  |  |  |  |  |  |  |  |  |  |  |  |  |  |  |  |  |  |  |  |  |
| Aug-11 | 9.1 |  |  |  |  |  |  |  |  |  |  |  |  |  |  |  |  |  |  |  |  |  |  |  |  |  |  |  |  |  |  |  |  |  |  |  |  |  |  |  |  |  |  |  |  |  |  |  |  |  |  |
| Sep-11 | 8.8 |  |  |  |  |  |  |  |  |  |  |  |  |  |  |  |  |  |  |  |  |  |  |  |  |  |  |  |  |  |  |  |  |  |  |  |  |  |  |  |  |  |  |  |  |  |  |  |  |  |  |
| Oct-11 | 8.5 |  |  |  |  |  |  |  |  |  |  |  |  |  |  |  |  |  |  |  |  |  |  |  |  |  |  |  |  |  |  |  |  |  |  |  |  |  |  |  |  |  |  |  |  |  |  |  |  |  |  |
| Nov-11 | 8.2 |  |  |  |  |  |  |  |  |  |  |  |  |  |  |  |  |  |  |  |  |  |  |  |  |  |  |  |  |  |  |  |  |  |  |  |  |  |  |  |  |  |  |  |  |  |  |  |  |  |  |
| Dec-11 | 8.3 |  |  |  |  |  |  |  |  |  |  |  |  |  |  |  |  |  |  |  |  |  |  |  |  |  |  |  |  |  |  |  |  |  |  |  |  |  |  |  |  |  |  |  |  |  |  |  |  |  |  |
| Jan-12 | 8.8 |  |  |  |  |  |  |  |  |  |  |  |  |  |  |  |  |  |  |  |  |  |  |  |  |  |  |  |  |  |  |  |  |  |  |  |  |  |  |  |  |  |  |  |  |  |  |  |  |  |  |
| Feb-12 | 8.7 |  |  |  |  |  |  |  |  |  |  |  |  |  |  |  |  |  |  |  |  |  |  |  |  |  |  |  |  |  |  |  |  |  |  |  |  |  |  |  |  |  |  |  |  |  |  |  |  |  |  |
| Mar-12 | 8.4 |  |  |  |  |  |  |  |  |  |  |  |  |  |  |  |  |  |  |  |  |  |  |  |  |  |  |  |  |  |  |  |  |  |  |  |  |  |  |  |  |  |  |  |  |  |  |  |  |  |  |
| Apr-12 | 7.7 |  |  |  |  |  |  |  |  |  |  |  |  |  |  |  |  |  |  |  |  |  |  |  |  |  |  |  |  |  |  |  |  |  |  |  |  |  |  |  |  |  |  |  |  |  |  |  |  |  |  |
| May-12 | 7.9 |  |  |  |  |  |  |  |  |  |  |  |  |  |  |  |  |  |  |  |  |  |  |  |  |  |  |  |  |  |  |  |  |  |  |  |  |  |  |  |  |  |  |  |  |  |  |  |  |  |  |
| Jun-12 | 8.4 |  |  |  |  |  |  |  |  |  |  |  |  |  |  |  |  |  |  |  |  |  |  |  |  |  |  |  |  |  |  |  |  |  |  |  |  |  |  |  |  |  |  |  |  |  |  |  |  |  |  |
| Jul-12 | 8.6 |  |  |  |  |  |  |  |  |  |  |  |  |  |  |  |  |  |  |  |  |  |  |  |  |  |  |  |  |  |  |  |  |  |  |  |  |  |  |  |  |  |  |  |  |  |  |  |  |  |  |
| Aug-12 | 8.2 |  |  |  |  |  |  |  |  |  |  |  |  |  |  |  |  |  |  |  |  |  |  |  |  |  |  |  |  |  |  |  |  |  |  |  |  |  |  |  |  |  |  |  |  |  |  |  |  |  |  |
| Sep-12 | 7.6 |  |  |  |  |  |  |  |  |  |  |  |  |  |  |  |  |  |  |  |  |  |  |  |  |  |  |  |  |  |  |  |  |  |  |  |  |  |  |  |  |  |  |  |  |  |  |  |  |  |  |
| Oct-12 | 7.5 |  |  |  |  |  |  |  |  |  |  |  |  |  |  |  |  |  |  |  |  |  |  |  |  |  |  |  |  |  |  |  |  |  |  |  |  |  |  |  |  |  |  |  |  |  |  |  |  |  |  |
| Nov-12 | 7.4 |  |  |  |  |  |  |  |  |  |  |  |  |  |  |  |  |  |  |  |  |  |  |  |  |  |  |  |  |  |  |  |  |  |  |  |  |  |  |  |  |  |  |  |  |  |  |  |  |  |  |
| Dec-12 | 7.6 |  |  |  |  |  |  |  |  |  |  |  |  |  |  |  |  |  |  |  |  |  |  |  |  |  |  |  |  |  |  |  |  |  |  |  |  |  |  |  |  |  |  |  |  |  |  |  |  |  |  |
| Jan-13 | 8.5 |  |  |  |  |  |  |  |  |  |  |  |  |  |  |  |  |  |  |  |  |  |  |  |  |  |  |  |  |  |  |  |  |  |  |  |  |  |  |  |  |  |  |  |  |  |  |  |  |  |  |
| Feb-13 | 8.1 |  |  |  |  |  |  |  |  |  |  |  |  |  |  |  |  |  |  |  |  |  |  |  |  |  |  |  |  |  |  |  |  |  |  |  |  |  |  |  |  |  |  |  |  |  |  |  |  |  |  |
| Mar-13 | 7.6 |  |  |  |  |  |  |  |  |  |  |  |  |  |  |  |  |  |  |  |  |  |  |  |  |  |  |  |  |  |  |  |  |  |  |  |  |  |  |  |  |  |  |  |  |  |  |  |  |  |  |
| Apr-13 | 7.1 |  |  |  |  |  |  |  |  |  |  |  |  |  |  |  |  |  |  |  |  |  |  |  |  |  |  |  |  |  |  |  |  |  |  |  |  |  |  |  |  |  |  |  |  |  |  |  |  |  |  |
| May-13 | 7.3 |  |  |  |  |  |  |  |  |  |  |  |  |  |  |  |  |  |  |  |  |  |  |  |  |  |  |  |  |  |  |  |  |  |  |  |  |  |  |  |  |  |  |  |  |  |  |  |  |  |  |
| Jun-13 | 7.8 |  |  |  |  |  |  |  |  |  |  |  |  |  |  |  |  |  |  |  |  |  |  |  |  |  |  |  |  |  |  |  |  |  |  |  |  |  |  |  |  |  |  |  |  |  |  |  |  |  |  |
| Jul-13 | 7.7 |  |  |  |  |  |  |  |  |  |  |  |  |  |  |  |  |  |  |  |  |  |  |  |  |  |  |  |  |  |  |  |  |  |  |  |  |  |  |  |  |  |  |  |  |  |  |  |  |  |  |
| Aug-13 | 7.3 |  |  |  |  |  |  |  |  |  |  |  |  |  |  |  |  |  |  |  |  |  |  |  |  |  |  |  |  |  |  |  |  |  |  |  |  |  |  |  |  |  |  |  |  |  |  |  |  |  |  |
| Sep-13 | 7 |  |  |  |  |  |  |  |  |  |  |  |  |  |  |  |  |  |  |  |  |  |  |  |  |  |  |  |  |  |  |  |  |  |  |  |  |  |  |  |  |  |  |  |  |  |  |  |  |  |  |
| Oct-13 | 7 |  |  |  |  |  |  |  |  |  |  |  |  |  |  |  |  |  |  |  |  |  |  |  |  |  |  |  |  |  |  |  |  |  |  |  |  |  |  |  |  |  |  |  |  |  |  |  |  |  |  |
| Nov-13 | 6.6 |  |  |  |  |  |  |  |  |  |  |  |  |  |  |  |  |  |  |  |  |  |  |  |  |  |  |  |  |  |  |  |  |  |  |  |  |  |  |  |  |  |  |  |  |  |  |  |  |  |  |
| Dec-13 | 6.5 |  |  |  |  |  |  |  |  |  |  |  |  |  |  |  |  |  |  |  |  |  |  |  |  |  |  |  |  |  |  |  |  |  |  |  |  |  |  |  |  |  |  |  |  |  |  |  |  |  |  |
| Jan-14 | 7 |  |  |  |  |  |  |  |  |  |  |  |  |  |  |  |  |  |  |  |  |  |  |  |  |  |  |  |  |  |  |  |  |  |  |  |  |  |  |  |  |  |  |  |  |  |  |  |  |  |  |
| Feb-14 | 7 |  |  |  |  |  |  |  |  |  |  |  |  |  |  |  |  |  |  |  |  |  |  |  |  |  |  |  |  |  |  |  |  |  |  |  |  |  |  |  |  |  |  |  |  |  |  |  |  |  |  |
| Mar-14 | 6.8 |  |  |  |  |  |  |  |  |  |  |  |  |  |  |  |  |  |  |  |  |  |  |  |  |  |  |  |  |  |  |  |  |  |  |  |  |  |  |  |  |  |  |  |  |  |  |  |  |  |  |
| Apr-14 | 5.9 |  |  |  |  |  |  |  |  |  |  |  |  |  |  |  |  |  |  |  |  |  |  |  |  |  |  |  |  |  |  |  |  |  |  |  |  |  |  |  |  |  |  |  |  |  |  |  |  |  |  |
| May-14 | 6.1 |  |  |  |  |  |  |  |  |  |  |  |  |  |  |  |  |  |  |  |  |  |  |  |  |  |  |  |  |  |  |  |  |  |  |  |  |  |  |  |  |  |  |  |  |  |  |  |  |  |  |
| Jun-14 | 6.3 |  |  |  |  |  |  |  |  |  |  |  |  |  |  |  |  |  |  |  |  |  |  |  |  |  |  |  |  |  |  |  |  |  |  |  |  |  |  |  |  |  |  |  |  |  |  |  |  |  |  |
| Jul-14 | 6.5 |  |  |  |  |  |  |  |  |  |  |  |  |  |  |  |  |  |  |  |  |  |  |  |  |  |  |  |  |  |  |  |  |  |  |  |  |  |  |  |  |  |  |  |  |  |  |  |  |  |  |
| Aug-14 | 6.3 |  |  |  |  |  |  |  |  |  |  |  |  |  |  |  |  |  |  |  |  |  |  |  |  |  |  |  |  |  |  |  |  |  |  |  |  |  |  |  |  |  |  |  |  |  |  |  |  |  |  |
| Sep-14 | 5.7 |  |  |  |  |  |  |  |  |  |  |  |  |  |  |  |  |  |  |  |  |  |  |  |  |  |  |  |  |  |  |  |  |  |  |  |  |  |  |  |  |  |  |  |  |  |  |  |  |  |  |
| Oct-14 | 5.5 |  |  |  |  |  |  |  |  |  |  |  |  |  |  |  |  |  |  |  |  |  |  |  |  |  |  |  |  |  |  |  |  |  |  |  |  |  |  |  |  |  |  |  |  |  |  |  |  |  |  |
| Nov-14 | 5.5 |  |  |  |  |  |  |  |  |  |  |  |  |  |  |  |  |  |  |  |  |  |  |  |  |  |  |  |  |  |  |  |  |  |  |  |  |  |  |  |  |  |  |  |  |  |  |  |  |  |  |
| Dec-14 | 5.4 |  |  |  |  |  |  |  |  |  |  |  |  |  |  |  |  |  |  |  |  |  |  |  |  |  |  |  |  |  |  |  |  |  |  |  |  |  |  |  |  |  |  |  |  |  |  |  |  |  |  |
| Jan-15 | 6.1 |  |  |  |  |  |  |  |  |  |  |  |  |  |  |  |  |  |  |  |  |  |  |  |  |  |  |  |  |  |  |  |  |  |  |  |  |  |  |  |  |  |  |  |  |  |  |  |  |  |  |
| Feb-15 | 5.8 |  |  |  |  |  |  |  |  |  |  |  |  |  |  |  |  |  |  |  |  |  |  |  |  |  |  |  |  |  |  |  |  |  |  |  |  |  |  |  |  |  |  |  |  |  |  |  |  |  |  |
| Mar-15 | 5.6 |  |  |  |  |  |  |  |  |  |  |  |  |  |  |  |  |  |  |  |  |  |  |  |  |  |  |  |  |  |  |  |  |  |  |  |  |  |  |  |  |  |  |  |  |  |  |  |  |  |  |
| Apr-15 | 5.1 |  |  |  |  |  |  |  |  |  |  |  |  |  |  |  |  |  |  |  |  |  |  |  |  |  |  |  |  |  |  |  |  |  |  |  |  |  |  |  |  |  |  |  |  |  |  |  |  |  |  |
| May-15 | 5.3 |  |  |  |  |  |  |  |  |  |  |  |  |  |  |  |  |  |  |  |  |  |  |  |  |  |  |  |  |  |  |  |  |  |  |  |  |  |  |  |  |  |  |  |  |  |  |  |  |  |  |
| Jun-15 | 5.5 |  |  |  |  |  |  |  |  |  |  |  |  |  |  |  |  |  |  |  |  |  |  |  |  |  |  |  |  |  |  |  |  |  |  |  |  |  |  |  |  |  |  |  |  |  |  |  |  |  |  |
| Jul-15 | 5.6 |  |  |  |  |  |  |  |  |  |  |  |  |  |  |  |  |  |  |  |  |  |  |  |  |  |  |  |  |  |  |  |  |  |  |  |  |  |  |  |  |  |  |  |  |  |  |  |  |  |  |
| Aug-15 | 5.2 |  |  |  |  |  |  |  |  |  |  |  |  |  |  |  |  |  |  |  |  |  |  |  |  |  |  |  |  |  |  |  |  |  |  |  |  |  |  |  |  |  |  |  |  |  |  |  |  |  |  |
| Sep-15 | 4.9 |  |  |  |  |  |  |  |  |  |  |  |  |  |  |  |  |  |  |  |  |  |  |  |  |  |  |  |  |  |  |  |  |  |  |  |  |  |  |  |  |  |  |  |  |  |  |  |  |  |  |
| Oct-15 | 4.8 |  |  |  |  |  |  |  |  |  |  |  |  |  |  |  |  |  |  |  |  |  |  |  |  |  |  |  |  |  |  |  |  |  |  |  |  |  |  |  |  |  |  |  |  |  |  |  |  |  |  |
| Nov-15 | 4.8 |  |  |  |  |  |  |  |  |  |  |  |  |  |  |  |  |  |  |  |  |  |  |  |  |  |  |  |  |  |  |  |  |  |  |  |  |  |  |  |  |  |  |  |  |  |  |  |  |  |  |
| Dec-15 | 4.8 |  |  |  |  |  |  |  |  |  |  |  |  |  |  |  |  |  |  |  |  |  |  |  |  |  |  |  |  |  |  |  |  |  |  |  |  |  |  |  |  |  |  |  |  |  |  |  |  |  |  |
| Jan-16 | 5.3 |  |  |  |  |  |  |  |  |  |  |  |  |  |  |  |  |  |  |  |  |  |  |  |  |  |  |  |  |  |  |  |  |  |  |  |  |  |  |  |  |  |  |  |  |  |  |  |  |  |  |
| Feb-16 | 5.2 |  |  |  |  |  |  |  |  |  |  |  |  |  |  |  |  |  |  |  |  |  |  |  |  |  |  |  |  |  |  |  |  |  |  |  |  |  |  |  |  |  |  |  |  |  |  |  |  |  |  |
| Mar-16 | 5.1 |  |  |  |  |  |  |  |  |  |  |  |  |  |  |  |  |  |  |  |  |  |  |  |  |  |  |  |  |  |  |  |  |  |  |  |  |  |  |  |  |  |  |  |  |  |  |  |  |  |  |
| Apr-16 | 4.7 |  |  |  |  |  |  |  |  |  |  |  |  |  |  |  |  |  |  |  |  |  |  |  |  |  |  |  |  |  |  |  |  |  |  |  |  |  |  |  |  |  |  |  |  |  |  |  |  |  |  |
| May-16 | 4.5 |  |  |  |  |  |  |  |  |  |  |  |  |  |  |  |  |  |  |  |  |  |  |  |  |  |  |  |  |  |  |  |  |  |  |  |  |  |  |  |  |  |  |  |  |  |  |  |  |  |  |
| Jun-16 | 5.1 |  |  |  |  |  |  |  |  |  |  |  |  |  |  |  |  |  |  |  |  |  |  |  |  |  |  |  |  |  |  |  |  |  |  |  |  |  |  |  |  |  |  |  |  |  |  |  |  |  |  |
| Jul-16 | 5.1 |  |  |  |  |  |  |  |  |  |  |  |  |  |  |  |  |  |  |  |  |  |  |  |  |  |  |  |  |  |  |  |  |  |  |  |  |  |  |  |  |  |  |  |  |  |  |  |  |  |  |
| Aug-16 | 5 |  |  |  |  |  |  |  |  |  |  |  |  |  |  |  |  |  |  |  |  |  |  |  |  |  |  |  |  |  |  |  |  |  |  |  |  |  |  |  |  |  |  |  |  |  |  |  |  |  |  |
| Sep-16 | 4.8 |  |  |  |  |  |  |  |  |  |  |  |  |  |  |  |  |  |  |  |  |  |  |  |  |  |  |  |  |  |  |  |  |  |  |  |  |  |  |  |  |  |  |  |  |  |  |  |  |  |  |
| Oct-16 | 4.7 |  |  |  |  |  |  |  |  |  |  |  |  |  |  |  |  |  |  |  |  |  |  |  |  |  |  |  |  |  |  |  |  |  |  |  |  |  |  |  |  |  |  |  |  |  |  |  |  |  |  |
| Nov-16 | 4.4 |  |  |  |  |  |  |  |  |  |  |  |  |  |  |  |  |  |  |  |  |  |  |  |  |  |  |  |  |  |  |  |  |  |  |  |  |  |  |  |  |  |  |  |  |  |  |  |  |  |  |
| Dec-16 | 4.5 |  |  |  |  |  |  |  |  |  |  |  |  |  |  |  |  |  |  |  |  |  |  |  |  |  |  |  |  |  |  |  |  |  |  |  |  |  |  |  |  |  |  |  |  |  |  |  |  |  |  |
| Jan-17 | 5.1 |  |  |  |  |  |  |  |  |  |  |  |  |  |  |  |  |  |  |  |  |  |  |  |  |  |  |  |  |  |  |  |  |  |  |  |  |  |  |  |  |  |  |  |  |  |  |  |  |  |  |
| Feb-17 | 4.9 |  |  |  |  |  |  |  |  |  |  |  |  |  |  |  |  |  |  |  |  |  |  |  |  |  |  |  |  |  |  |  |  |  |  |  |  |  |  |  |  |  |  |  |  |  |  |  |  |  |  |
| Mar-17 | 4.6 |  |  |  |  |  |  |  |  |  |  |  |  |  |  |  |  |  |  |  |  |  |  |  |  |  |  |  |  |  |  |  |  |  |  |  |  |  |  |  |  |  |  |  |  |  |  |  |  |  |  |
| Apr-17 | 4.1 |  |  |  |  |  |  |  |  |  |  |  |  |  |  |  |  |  |  |  |  |  |  |  |  |  |  |  |  |  |  |  |  |  |  |  |  |  |  |  |  |  |  |  |  |  |  |  |  |  |  |
| May-17 | 4.1 |  |  |  |  |  |  |  |  |  |  |  |  |  |  |  |  |  |  |  |  |  |  |  |  |  |  |  |  |  |  |  |  |  |  |  |  |  |  |  |  |  |  |  |  |  |  |  |  |  |  |
| Jun-17 | 4.5 |  |  |  |  |  |  |  |  |  |  |  |  |  |  |  |  |  |  |  |  |  |  |  |  |  |  |  |  |  |  |  |  |  |  |  |  |  |  |  |  |  |  |  |  |  |  |  |  |  |  |
| Jul-17 | 4.6 |  |  |  |  |  |  |  |  |  |  |  |  |  |  |  |  |  |  |  |  |  |  |  |  |  |  |  |  |  |  |  |  |  |  |  |  |  |  |  |  |  |  |  |  |  |  |  |  |  |  |
| Aug-17 | 4.5 |  |  |  |  |  |  |  |  |  |  |  |  |  |  |  |  |  |  |  |  |  |  |  |  |  |  |  |  |  |  |  |  |  |  |  |  |  |  |  |  |  |  |  |  |  |  |  |  |  |  |
| Sep-17 | 4.1 |  |  |  |  |  |  |  |  |  |  |  |  |  |  |  |  |  |  |  |  |  |  |  |  |  |  |  |  |  |  |  |  |  |  |  |  |  |  |  |  |  |  |  |  |  |  |  |  |  |  |
| Oct-17 | 3.9 |  |  |  |  |  |  |  |  |  |  |  |  |  |  |  |  |  |  |  |  |  |  |  |  |  |  |  |  |  |  |  |  |  |  |  |  |  |  |  |  |  |  |  |  |  |  |  |  |  |  |
| Nov-17 | 3.9 |  |  |  |  |  |  |  |  |  |  |  |  |  |  |  |  |  |  |  |  |  |  |  |  |  |  |  |  |  |  |  |  |  |  |  |  |  |  |  |  |  |  |  |  |  |  |  |  |  |  |
| Dec-17 | 3.9 |  |  |  |  |  |  |  |  |  |  |  |  |  |  |  |  |  |  |  |  |  |  |  |  |  |  |  |  |  |  |  |  |  |  |  |  |  |  |  |  |  |  |  |  |  |  |  |  |  |  |
| Jan-18 | 4.5 |  |  |  |  |  |  |  |  |  |  |  |  |  |  |  |  |  |  |  |  |  |  |  |  |  |  |  |  |  |  |  |  |  |  |  |  |  |  |  |  |  |  |  |  |  |  |  |  |  |  |
| Feb-18 | 4.4 |  |  |  |  |  |  |  |  |  |  |  |  |  |  |  |  |  |  |  |  |  |  |  |  |  |  |  |  |  |  |  |  |  |  |  |  |  |  |  |  |  |  |  |  |  |  |  |  |  |  |
| Mar-18 | 4.1 |  |  |  |  |  |  |  |  |  |  |  |  |  |  |  |  |  |  |  |  |  |  |  |  |  |  |  |  |  |  |  |  |  |  |  |  |  |  |  |  |  |  |  |  |  |  |  |  |  |  |
| Apr-18 | 3.7 |  |  |  |  |  |  |  |  |  |  |  |  |  |  |  |  |  |  |  |  |  |  |  |  |  |  |  |  |  |  |  |  |  |  |  |  |  |  |  |  |  |  |  |  |  |  |  |  |  |  |
| May-18 | 3.6 |  |  |  |  |  |  |  |  |  |  |  |  |  |  |  |  |  |  |  |  |  |  |  |  |  |  |  |  |  |  |  |  |  |  |  |  |  |  |  |  |  |  |  |  |  |  |  |  |  |  |
| Jun-18 | 4.2 |  |  |  |  |  |  |  |  |  |  |  |  |  |  |  |  |  |  |  |  |  |  |  |  |  |  |  |  |  |  |  |  |  |  |  |  |  |  |  |  |  |  |  |  |  |  |  |  |  |  |
| Jul-18 | 4.1 |  |  |  |  |  |  |  |  |  |  |  |  |  |  |  |  |  |  |  |  |  |  |  |  |  |  |  |  |  |  |  |  |  |  |  |  |  |  |  |  |  |  |  |  |  |  |  |  |  |  |
| Aug-18 | 3.9 |  |  |  |  |  |  |  |  |  |  |  |  |  |  |  |  |  |  |  |  |  |  |  |  |  |  |  |  |  |  |  |  |  |  |  |  |  |  |  |  |  |  |  |  |  |  |  |  |  |  |
| Sep-18 | 3.6 |  |  |  |  |  |  |  |  |  |  |  |  |  |  |  |  |  |  |  |  |  |  |  |  |  |  |  |  |  |  |  |  |  |  |  |  |  |  |  |  |  |  |  |  |  |  |  |  |  |  |
| Oct-18 | 3.5 |  |  |  |  |  |  |  |  |  |  |  |  |  |  |  |  |  |  |  |  |  |  |  |  |  |  |  |  |  |  |  |  |  |  |  |  |  |  |  |  |  |  |  |  |  |  |  |  |  |  |
| Nov-18 | 3.5 |  |  |  |  |  |  |  |  |  |  |  |  |  |  |  |  |  |  |  |  |  |  |  |  |  |  |  |  |  |  |  |  |  |  |  |  |  |  |  |  |  |  |  |  |  |  |  |  |  |  |
| Dec-18 | 3.7 |  |  |  |  |  |  |  |  |  |  |  |  |  |  |  |  |  |  |  |  |  |  |  |  |  |  |  |  |  |  |  |  |  |  |  |  |  |  |  |  |  |  |  |  |  |  |  |  |  |  |
| Jan-19 | 4.4 |  |  |  |  |  |  |  |  |  |  |  |  |  |  |  |  |  |  |  |  |  |  |  |  |  |  |  |  |  |  |  |  |  |  |  |  |  |  |  |  |  |  |  |  |  |  |  |  |  |  |
| Feb-19 | 4.1 |  |  |  |  |  |  |  |  |  |  |  |  |  |  |  |  |  |  |  |  |  |  |  |  |  |  |  |  |  |  |  |  |  |  |  |  |  |  |  |  |  |  |  |  |  |  |  |  |  |  |
| Mar-19 | 3.9 |  |  |  |  |  |  |  |  |  |  |  |  |  |  |  |  |  |  |  |  |  |  |  |  |  |  |  |  |  |  |  |  |  |  |  |  |  |  |  |  |  |  |  |  |  |  |  |  |  |  |
| Apr-19 | 3.3 |  |  |  |  |  |  |  |  |  |  |  |  |  |  |  |  |  |  |  |  |  |  |  |  |  |  |  |  |  |  |  |  |  |  |  |  |  |  |  |  |  |  |  |  |  |  |  |  |  |  |
| May-19 | 3.4 |  |  |  |  |  |  |  |  |  |  |  |  |  |  |  |  |  |  |  |  |  |  |  |  |  |  |  |  |  |  |  |  |  |  |  |  |  |  |  |  |  |  |  |  |  |  |  |  |  |  |
| Jun-19 | 3.8 |  |  |  |  |  |  |  |  |  |  |  |  |  |  |  |  |  |  |  |  |  |  |  |  |  |  |  |  |  |  |  |  |  |  |  |  |  |  |  |  |  |  |  |  |  |  |  |  |  |  |
| Jul-19 | 4 |  |  |  |  |  |  |  |  |  |  |  |  |  |  |  |  |  |  |  |  |  |  |  |  |  |  |  |  |  |  |  |  |  |  |  |  |  |  |  |  |  |  |  |  |  |  |  |  |  |  |
| Aug-19 | 3.8 |  |  |  |  |  |  |  |  |  |  |  |  |  |  |  |  |  |  |  |  |  |  |  |  |  |  |  |  |  |  |  |  |  |  |  |  |  |  |  |  |  |  |  |  |  |  |  |  |  |  |
| Sep-19 | 3.3 |  |  |  |  |  |  |  |  |  |  |  |  |  |  |  |  |  |  |  |  |  |  |  |  |  |  |  |  |  |  |  |  |  |  |  |  |  |  |  |  |  |  |  |  |  |  |  |  |  |  |
| Oct-19 | 3.3 |  |  |  |  |  |  |  |  |  |  |  |  |  |  |  |  |  |  |  |  |  |  |  |  |  |  |  |  |  |  |  |  |  |  |  |  |  |  |  |  |  |  |  |  |  |  |  |  |  |  |
| Nov-19 | 3.3 |  |  |  |  |  |  |  |  |  |  |  |  |  |  |  |  |  |  |  |  |  |  |  |  |  |  |  |  |  |  |  |  |  |  |  |  |  |  |  |  |  |  |  |  |  |  |  |  |  |  |
| Dec-19 | 3.4 |  |  |  |  |  |  |  |  |  |  |  |  |  |  |  |  |  |  |  |  |  |  |  |  |  |  |  |  |  |  |  |  |  |  |  |  |  |  |  |  |  |  |  |  |  |  |  |  |  |  |
| Jan-20 | 4 |  |  |  |  |  |  |  |  |  |  |  |  |  |  |  |  |  |  |  |  |  |  |  |  |  |  |  |  |  |  |  |  |  |  |  |  |  |  |  |  |  |  |  |  |  |  |  |  |  |  |
| Feb-20 | 3.8 |  |  |  |  |  |  |  |  |  |  |  |  |  |  |  |  |  |  |  |  |  |  |  |  |  |  |  |  |  |  |  |  |  |  |  |  |  |  |  |  |  |  |  |  |  |  |  |  |  |  |
| Mar-20 | 4.5 |  |  |  |  |  |  |  |  |  |  |  |  |  |  |  |  |  |  |  |  |  |  |  |  |  |  |  |  |  |  |  |  |  |  |  |  |  |  |  |  |  |  |  |  |  |  |  |  |  |  |
| Apr-20 | 14.4 |  |  |  |  |  |  |  |  |  |  |  |  |  |  |  |  |  |  |  |  |  |  |  |  |  |  |  |  |  |  |  |  |  |  |  |  |  |  |  |  |  |  |  |  |  |  |  |  |  |  |
| May-20 | 13 |  |  |  |  |  |  |  |  |  |  |  |  |  |  |  |  |  |  |  |  |  |  |  |  |  |  |  |  |  |  |  |  |  |  |  |  |  |  |  |  |  |  |  |  |  |  |  |  |  |  |
| Jun-20 | 11.2 |  |  |  |  |  |  |  |  |  |  |  |  |  |  |  |  |  |  |  |  |  |  |  |  |  |  |  |  |  |  |  |  |  |  |  |  |  |  |  |  |  |  |  |  |  |  |  |  |  |  |
| Jul-20 | 10.5 |  |  |  |  |  |  |  |  |  |  |  |  |  |  |  |  |  |  |  |  |  |  |  |  |  |  |  |  |  |  |  |  |  |  |  |  |  |  |  |  |  |  |  |  |  |  |  |  |  |  |
| Aug-20 | 8.5 |  |  |  |  |  |  |  |  |  |  |  |  |  |  |  |  |  |  |  |  |  |  |  |  |  |  |  |  |  |  |  |  |  |  |  |  |  |  |  |  |  |  |  |  |  |  |  |  |  |  |
| Sep-20 | 7.7 |  |  |  |  |  |  |  |  |  |  |  |  |  |  |  |  |  |  |  |  |  |  |  |  |  |  |  |  |  |  |  |  |  |  |  |  |  |  |  |  |  |  |  |  |  |  |  |  |  |  |
| Oct-20 | 6.6 |  |  |  |  |  |  |  |  |  |  |  |  |  |  |  |  |  |  |  |  |  |  |  |  |  |  |  |  |  |  |  |  |  |  |  |  |  |  |  |  |  |  |  |  |  |  |  |  |  |  |
| Nov-20 | 6.4 |  |  |  |  |  |  |  |  |  |  |  |  |  |  |  |  |  |  |  |  |  |  |  |  |  |  |  |  |  |  |  |  |  |  |  |  |  |  |  |  |  |  |  |  |  |  |  |  |  |  |
| Dec-20 | 6.5 |  |  |  |  |  |  |  |  |  |  |  |  |  |  |  |  |  |  |  |  |  |  |  |  |  |  |  |  |  |  |  |  |  |  |  |  |  |  |  |  |  |  |  |  |  |  |  |  |  |  |
| Jan-21 | 6.8 |  |  |  |  |  |  |  |  |  |  |  |  |  |  |  |  |  |  |  |  |  |  |  |  |  |  |  |  |  |  |  |  |  |  |  |  |  |  |  |  |  |  |  |  |  |  |  |  |  |  |
| Feb-21 | 6.6 |  |  |  |  |  |  |  |  |  |  |  |  |  |  |  |  |  |  |  |  |  |  |  |  |  |  |  |  |  |  |  |  |  |  |  |  |  |  |  |  |  |  |  |  |  |  |  |  |  |  |
| Mar-21 | 6.2 |  |  |  |  |  |  |  |  |  |  |  |  |  |  |  |  |  |  |  |  |  |  |  |  |  |  |  |  |  |  |  |  |  |  |  |  |  |  |  |  |  |  |  |  |  |  |  |  |  |  |
| Apr-21 | 5.7 |  |  |  |  |  |  |  |  |  |  |  |  |  |  |  |  |  |  |  |  |  |  |  |  |  |  |  |  |  |  |  |  |  |  |  |  |  |  |  |  |  |  |  |  |  |  |  |  |  |  |
| May-21 | 5.5 |  |  |  |  |  |  |  |  |  |  |  |  |  |  |  |  |  |  |  |  |  |  |  |  |  |  |  |  |  |  |  |  |  |  |  |  |  |  |  |  |  |  |  |  |  |  |  |  |  |  |
| Jun-21 | 6.1 |  |  |  |  |  |  |  |  |  |  |  |  |  |  |  |  |  |  |  |  |  |  |  |  |  |  |  |  |  |  |  |  |  |  |  |  |  |  |  |  |  |  |  |  |  |  |  |  |  |  |
| Jul-21 | 5.7 |  |  |  |  |  |  |  |  |  |  |  |  |  |  |  |  |  |  |  |  |  |  |  |  |  |  |  |  |  |  |  |  |  |  |  |  |  |  |  |  |  |  |  |  |  |  |  |  |  |  |
| Aug-21 | 5.3 |  |  |  |  |  |  |  |  |  |  |  |  |  |  |  |  |  |  |  |  |  |  |  |  |  |  |  |  |  |  |  |  |  |  |  |  |  |  |  |  |  |  |  |  |  |  |  |  |  |  |
| Sep-21 | 4.6 |  |  |  |  |  |  |  |  |  |  |  |  |  |  |  |  |  |  |  |  |  |  |  |  |  |  |  |  |  |  |  |  |  |  |  |  |  |  |  |  |  |  |  |  |  |  |  |  |  |  |
| Oct-21 | 4.3 |  |  |  |  |  |  |  |  |  |  |  |  |  |  |  |  |  |  |  |  |  |  |  |  |  |  |  |  |  |  |  |  |  |  |  |  |  |  |  |  |  |  |  |  |  |  |  |  |  |  |
| Nov-21 | 3.9 |  |  |  |  |  |  |  |  |  |  |  |  |  |  |  |  |  |  |  |  |  |  |  |  |  |  |  |  |  |  |  |  |  |  |  |  |  |  |  |  |  |  |  |  |  |  |  |  |  |  |
| Dec-21 | 3.7 |  |  |  |  |  |  |  |  |  |  |  |  |  |  |  |  |  |  |  |  |  |  |  |  |  |  |  |  |  |  |  |  |  |  |  |  |  |  |  |  |  |  |  |  |  |  |  |  |  |  |
| Jan-22 | 4.4 |  |  |  |  |  |  |  |  |  |  |  |  |  |  |  |  |  |  |  |  |  |  |  |  |  |  |  |  |  |  |  |  |  |  |  |  |  |  |  |  |  |  |  |  |  |  |  |  |  |  |
| Feb-22 | 4.1 |  |  |  |  |  |  |  |  |  |  |  |  |  |  |  |  |  |  |  |  |  |  |  |  |  |  |  |  |  |  |  |  |  |  |  |  |  |  |  |  |  |  |  |  |  |  |  |  |  |  |
| Mar-22 | 3.8 |  |  |  |  |  |  |  |  |  |  |  |  |  |  |  |  |  |  |  |  |  |  |  |  |  |  |  |  |  |  |  |  |  |  |  |  |  |  |  |  |  |  |  |  |  |  |  |  |  |  |
| Apr-22 | 3.3 |  |  |  |  |  |  |  |  |  |  |  |  |  |  |  |  |  |  |  |  |  |  |  |  |  |  |  |  |  |  |  |  |  |  |  |  |  |  |  |  |  |  |  |  |  |  |  |  |  |  |
| May-22 | 3.4 |  |  |  |  |  |  |  |  |  |  |  |  |  |  |  |  |  |  |  |  |  |  |  |  |  |  |  |  |  |  |  |  |  |  |  |  |  |  |  |  |  |  |  |  |  |  |  |  |  |  |
| Jun-22 | 3.8 |  |  |  |  |  |  |  |  |  |  |  |  |  |  |  |  |  |  |  |  |  |  |  |  |  |  |  |  |  |  |  |  |  |  |  |  |  |  |  |  |  |  |  |  |  |  |  |  |  |  |
| Jul-22 | 3.8 |  |  |  |  |  |  |  |  |  |  |  |  |  |  |  |  |  |  |  |  |  |  |  |  |  |  |  |  |  |  |  |  |  |  |  |  |  |  |  |  |  |  |  |  |  |  |  |  |  |  |
| Aug-22 | 3.8 |  |  |  |  |  |  |  |  |  |  |  |  |  |  |  |  |  |  |  |  |  |  |  |  |  |  |  |  |  |  |  |  |  |  |  |  |  |  |  |  |  |  |  |  |  |  |  |  |  |  |
| Sep-22 | 3.3 |  |  |  |  |  |  |  |  |  |  |  |  |  |  |  |  |  |  |  |  |  |  |  |  |  |  |  |  |  |  |  |  |  |  |  |  |  |  |  |  |  |  |  |  |  |  |  |  |  |  |